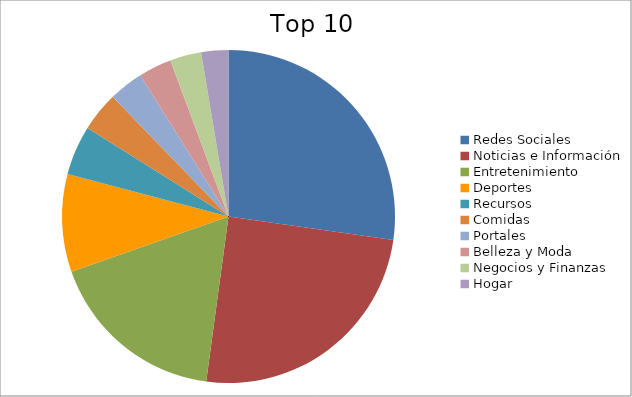
| Category | Series 0 |
|---|---|
| Redes Sociales | 25.04 |
| Noticias e Información | 22.86 |
| Entretenimiento | 16.05 |
| Deportes | 8.73 |
| Recursos | 4.42 |
| Comidas | 3.53 |
| Portales | 3.09 |
| Belleza y Moda | 2.94 |
| Negocios y Finanzas | 2.79 |
| Hogar | 2.42 |